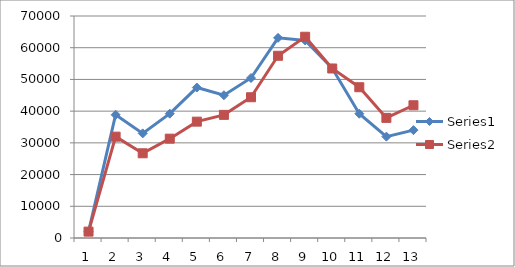
| Category | Series 0 | Series 1 |
|---|---|---|
| 0 | 2007 | 2011 |
| 1 | 38860 | 31953 |
| 2 | 32987 | 26709 |
| 3 | 39201 | 31322 |
| 4 | 47439 | 36687 |
| 5 | 45013 | 38825 |
| 6 | 50449 | 44381 |
| 7 | 63114 | 57460 |
| 8 | 62291 | 63456 |
| 9 | 53503 | 53446 |
| 10 | 39193 | 47539 |
| 11 | 31962 | 37875 |
| 12 | 34006 | 41858 |